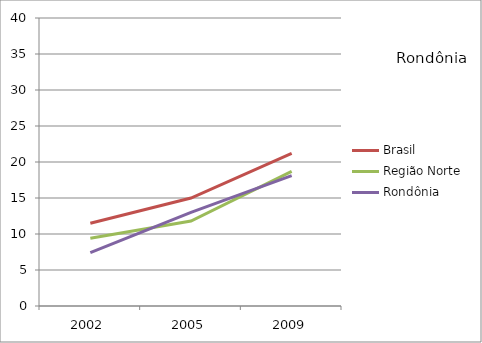
| Category | Brasil | Região Norte | Rondônia |
|---|---|---|---|
| 2002.0 | 11.5 | 9.4 | 7.4 |
| 2005.0 | 15 | 11.8 | 13 |
| 2009.0 | 21.2 | 18.7 | 18.1 |